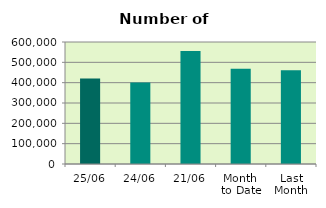
| Category | Series 0 |
|---|---|
| 25/06 | 420472 |
| 24/06 | 400744 |
| 21/06 | 555770 |
| Month 
to Date | 468813.294 |
| Last
Month | 461152.818 |